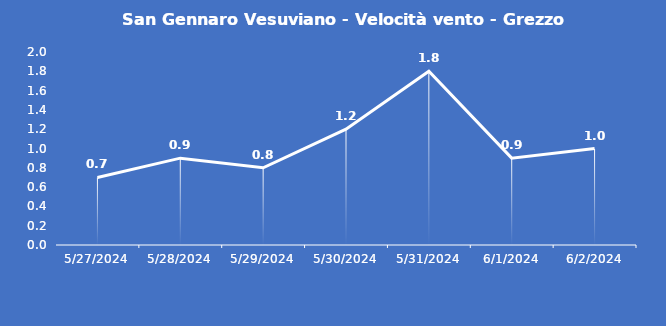
| Category | San Gennaro Vesuviano - Velocità vento - Grezzo (m/s) |
|---|---|
| 5/27/24 | 0.7 |
| 5/28/24 | 0.9 |
| 5/29/24 | 0.8 |
| 5/30/24 | 1.2 |
| 5/31/24 | 1.8 |
| 6/1/24 | 0.9 |
| 6/2/24 | 1 |